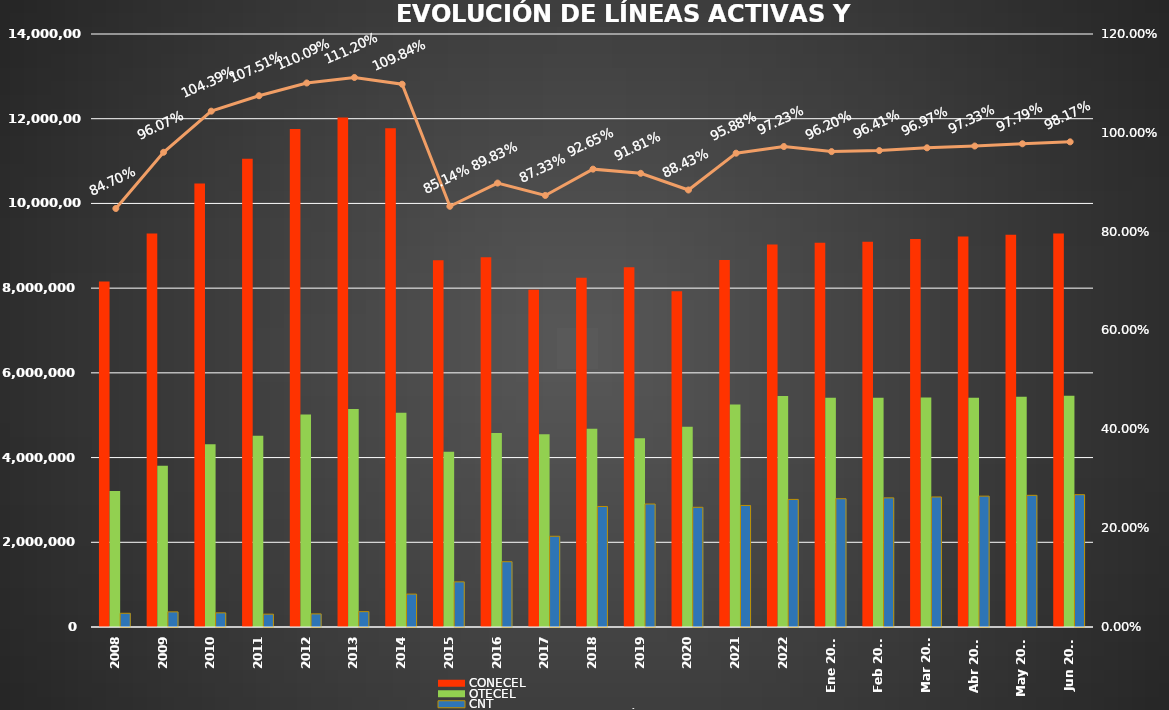
| Category | CONECEL | OTECEL | CNT |
|---|---|---|---|
| 2008 | 8156359 | 3211922 | 323967 |
| 2009 | 9291268 | 3806432 | 356900 |
| 2010 | 10470502 | 4314599 | 333730 |
| 2011 | 11057316 | 4513874 | 303368 |
| 2012 | 11757906 | 5019686 | 309271 |
| 2013 | 12030886 | 5148308 | 362560 |
| 2014 | 11772020 | 5055645 | 776892 |
| 2015 | 8658619 | 4134698 | 1065703 |
| 2016 | 8726823 | 4580092 | 1541219 |
| 2017 | 7960263 | 4549024 | 2142117 |
| 2018 | 8248050 | 4679646 | 2845142 |
| 2019 | 8493054 | 4456356 | 2903690 |
| 2020 | 7929253 | 4729725 | 2826388 |
| 2021 | 8665715 | 5254468 | 2869417 |
| 2022 | 9027737 | 5451115 | 3011899 |
| Ene 2023 | 9073421 | 5411860 | 3028254 |
| Feb 2023 | 9092490 | 5410682 | 3048837 |
| Mar 2023 | 9162562 | 5419670 | 3070611 |
| Abr 2023 | 9220042 | 5409581 | 3089410 |
| May 2023 | 9259499 | 5434175 | 3108405 |
| Jun 2023 | 9290231 | 5458655 | 3123905 |